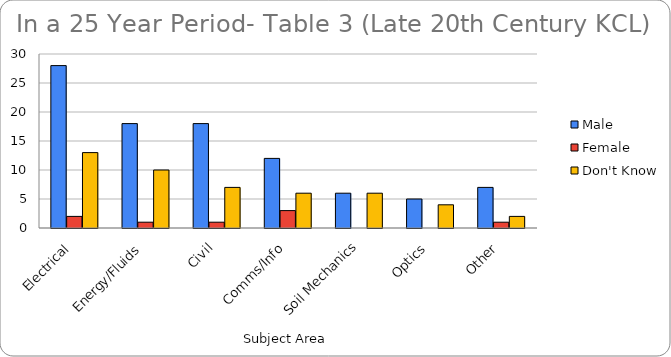
| Category | Male | Female | Don't Know |
|---|---|---|---|
| Electrical | 28 | 2 | 13 |
| Energy/Fluids | 18 | 1 | 10 |
| Civil | 18 | 1 | 7 |
| Comms/Info | 12 | 3 | 6 |
| Soil Mechanics | 6 | 0 | 6 |
| Optics | 5 | 0 | 4 |
| Other | 7 | 1 | 2 |